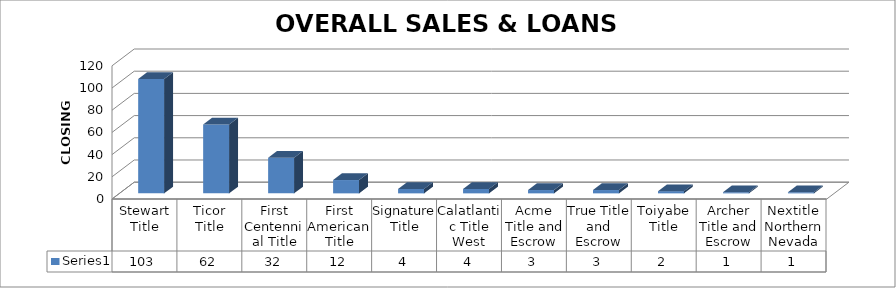
| Category | Series 0 |
|---|---|
| Stewart Title | 103 |
| Ticor Title | 62 |
| First Centennial Title | 32 |
| First American Title | 12 |
| Signature Title | 4 |
| Calatlantic Title West | 4 |
| Acme Title and Escrow | 3 |
| True Title and Escrow | 3 |
| Toiyabe Title | 2 |
| Archer Title and Escrow | 1 |
| Nextitle Northern Nevada | 1 |